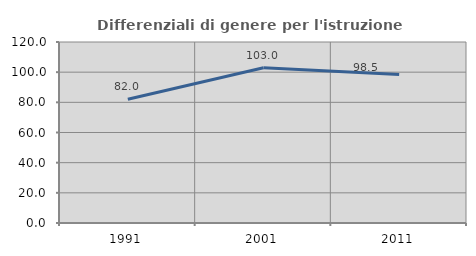
| Category | Differenziali di genere per l'istruzione superiore |
|---|---|
| 1991.0 | 81.989 |
| 2001.0 | 102.961 |
| 2011.0 | 98.459 |